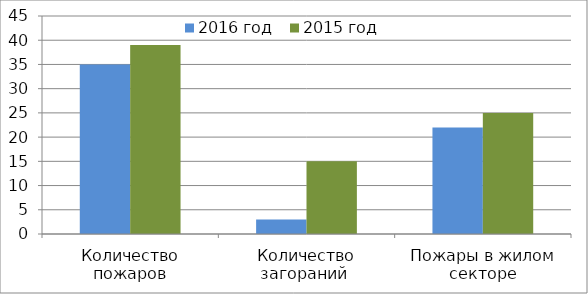
| Category | 2016 год | 2015 год |
|---|---|---|
| Количество пожаров | 35 | 39 |
| Количество загораний  | 3 | 15 |
| Пожары в жилом секторе | 22 | 25 |